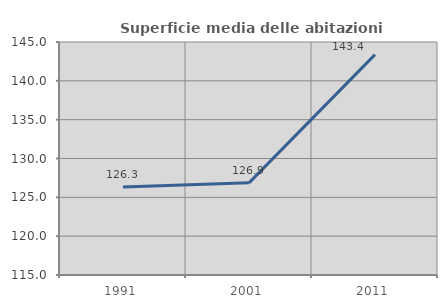
| Category | Superficie media delle abitazioni occupate |
|---|---|
| 1991.0 | 126.343 |
| 2001.0 | 126.864 |
| 2011.0 | 143.373 |